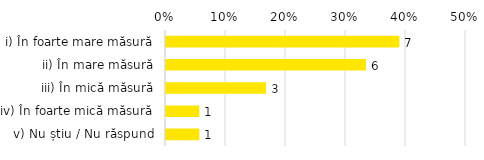
| Category | Total |
|---|---|
| i) În foarte mare măsură | 0.389 |
| ii) În mare măsură | 0.333 |
| iii) În mică măsură | 0.167 |
| iv) În foarte mică măsură | 0.056 |
| v) Nu știu / Nu răspund | 0.056 |